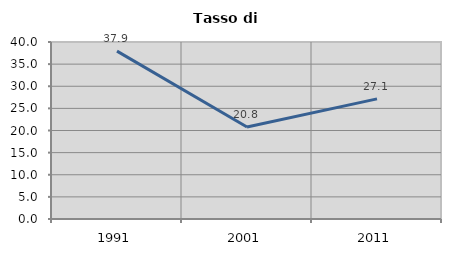
| Category | Tasso di disoccupazione   |
|---|---|
| 1991.0 | 37.937 |
| 2001.0 | 20.8 |
| 2011.0 | 27.143 |